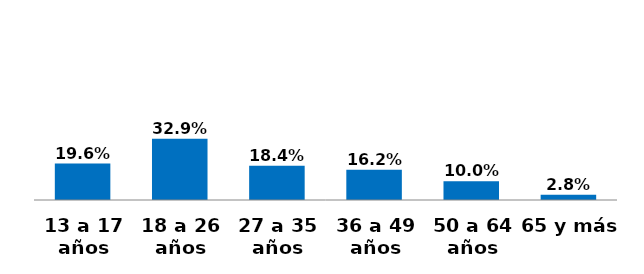
| Category | Series 0 |
|---|---|
| 13 a 17 años | 0.196 |
| 18 a 26 años | 0.329 |
| 27 a 35 años | 0.184 |
| 36 a 49 años | 0.162 |
| 50 a 64 años | 0.1 |
| 65 y más | 0.028 |